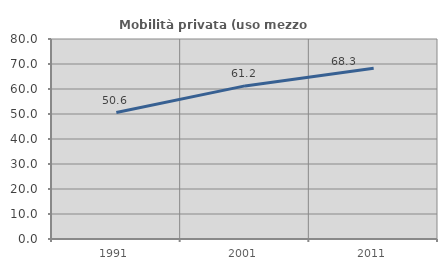
| Category | Mobilità privata (uso mezzo privato) |
|---|---|
| 1991.0 | 50.6 |
| 2001.0 | 61.239 |
| 2011.0 | 68.279 |